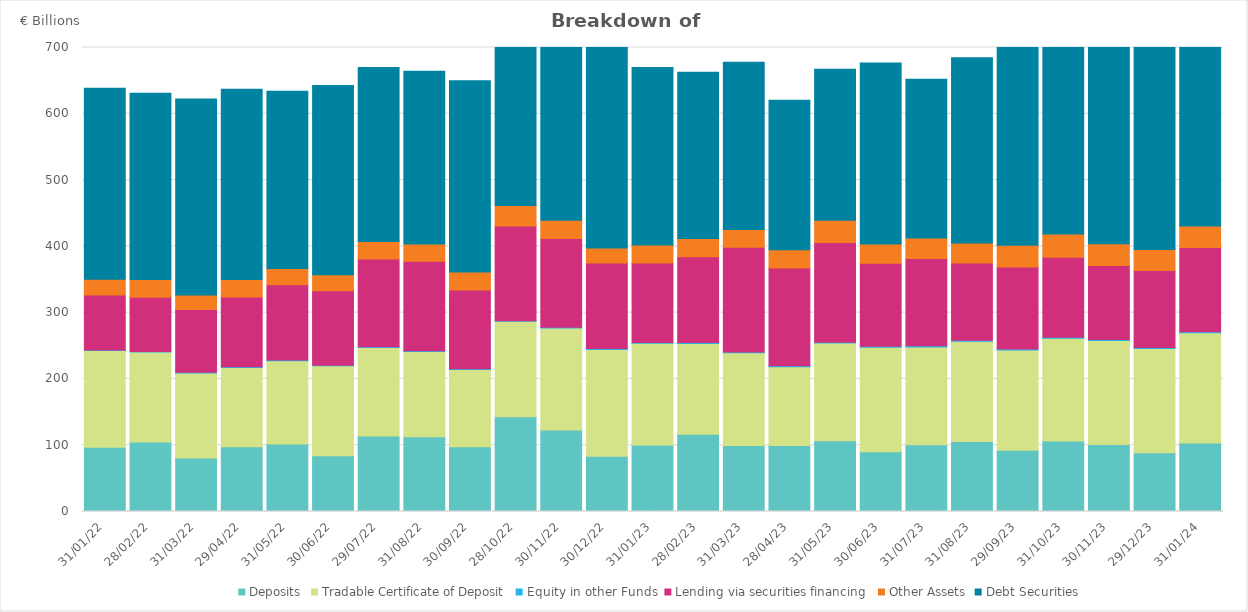
| Category | Deposits | Tradable Certificate of Deposit | Equity in other Funds | Lending via securities financing  | Other Assets | Debt Securities |
|---|---|---|---|---|---|---|
| 2022-01-31 | 96.931 | 145.783 | 0.951 | 82.998 | 23.782 | 288.022 |
| 2022-02-28 | 104.979 | 135.542 | 0.958 | 81.764 | 26.849 | 280.936 |
| 2022-03-31 | 80.633 | 128.457 | 0.891 | 94.76 | 22.064 | 295.665 |
| 2022-04-29 | 97.612 | 119.74 | 0.967 | 105.41 | 26.41 | 286.718 |
| 2022-05-31 | 101.959 | 125.629 | 0.978 | 113.582 | 24.392 | 267.425 |
| 2022-06-30 | 84.23 | 135.586 | 0.878 | 112.255 | 24.147 | 285.732 |
| 2022-07-29 | 113.998 | 133.584 | 0.941 | 132.268 | 26.511 | 262.645 |
| 2022-08-31 | 112.946 | 128.389 | 1.121 | 135.04 | 26.093 | 260.702 |
| 2022-09-30 | 97.817 | 116.577 | 0.971 | 118.666 | 27.367 | 288.49 |
| 2022-10-28 | 143.019 | 143.832 | 1.017 | 142.983 | 30.956 | 297.944 |
| 2022-11-30 | 122.764 | 154.139 | 1.043 | 134.023 | 27.581 | 304.953 |
| 2022-12-30 | 83.366 | 161.193 | 1.222 | 128.925 | 22.665 | 302.782 |
| 2023-01-31 | 100.171 | 153.568 | 1.288 | 119.974 | 26.982 | 267.843 |
| 2023-02-28 | 116.596 | 136.961 | 1.342 | 129.497 | 27.521 | 250.886 |
| 2023-03-31 | 99.51 | 139.93 | 1.221 | 157.945 | 26.846 | 252.237 |
| 2023-04-28 | 99.71 | 118.618 | 1.482 | 147.59 | 27.376 | 225.646 |
| 2023-05-31 | 106.898 | 147.175 | 1.3 | 150.427 | 33.691 | 227.549 |
| 2023-06-30 | 90.308 | 157.571 | 1.429 | 125.268 | 28.982 | 272.938 |
| 2023-07-31 | 100.666 | 147.634 | 1.692 | 131.514 | 30.945 | 239.728 |
| 2023-08-31 | 105.467 | 151.48 | 1.518 | 116.315 | 30.197 | 279.502 |
| 2023-09-29 | 92.274 | 151.375 | 1.604 | 123.79 | 32.715 | 300.374 |
| 2023-10-31 | 106.234 | 154.997 | 1.521 | 120.907 | 35.008 | 286.899 |
| 2023-11-30 | 101.01 | 156.797 | 1.543 | 111.625 | 33.007 | 331.991 |
| 2023-12-29 | 88.472 | 157.546 | 1.451 | 116.062 | 31.579 | 341.16 |
| 2024-01-31 | 103.444 | 166.339 | 1.455 | 127.158 | 32.38 | 326.476 |